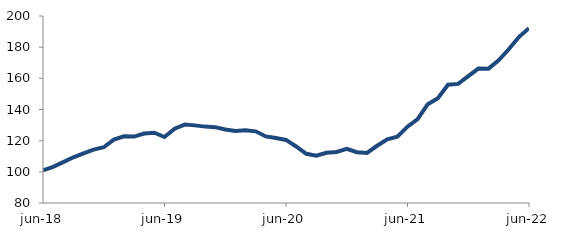
| Category | Series 0 |
|---|---|
| 2018-06-01 | 100.939 |
| 2018-07-01 | 103.223 |
| 2018-08-01 | 106.194 |
| 2018-09-01 | 109.327 |
| 2018-10-01 | 111.815 |
| 2018-11-01 | 114.242 |
| 2018-12-01 | 115.778 |
| 2019-01-01 | 120.689 |
| 2019-02-01 | 122.792 |
| 2019-03-01 | 122.605 |
| 2019-04-01 | 124.541 |
| 2019-05-01 | 125.115 |
| 2019-06-01 | 122.365 |
| 2019-07-01 | 127.653 |
| 2019-08-01 | 130.323 |
| 2019-09-01 | 129.814 |
| 2019-10-01 | 129.013 |
| 2019-11-01 | 128.663 |
| 2019-12-01 | 127.192 |
| 2020-01-01 | 126.144 |
| 2020-02-01 | 126.638 |
| 2020-03-01 | 125.992 |
| 2020-04-01 | 122.726 |
| 2020-05-01 | 121.669 |
| 2020-06-01 | 120.485 |
| 2020-07-01 | 116.268 |
| 2020-08-01 | 111.597 |
| 2020-09-01 | 110.39 |
| 2020-10-01 | 112.229 |
| 2020-11-01 | 112.769 |
| 2020-12-01 | 114.741 |
| 2021-01-01 | 112.625 |
| 2021-02-01 | 112.14 |
| 2021-03-01 | 116.74 |
| 2021-04-01 | 120.911 |
| 2021-05-01 | 122.536 |
| 2021-06-01 | 128.968 |
| 2021-07-01 | 133.864 |
| 2021-08-01 | 143.384 |
| 2021-09-01 | 147.196 |
| 2021-10-01 | 155.883 |
| 2021-11-01 | 156.426 |
| 2021-12-01 | 161.4 |
| 2022-01-01 | 166.276 |
| 2022-02-01 | 166.219 |
| 2022-03-01 | 171.531 |
| 2022-04-01 | 178.644 |
| 2022-05-01 | 186.465 |
| 2022-06-01 | 192.187 |